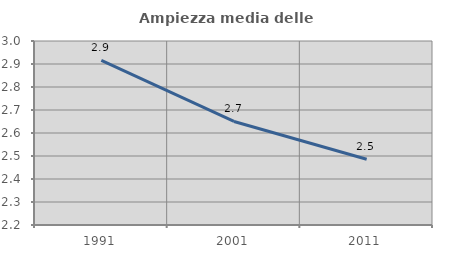
| Category | Ampiezza media delle famiglie |
|---|---|
| 1991.0 | 2.916 |
| 2001.0 | 2.65 |
| 2011.0 | 2.486 |